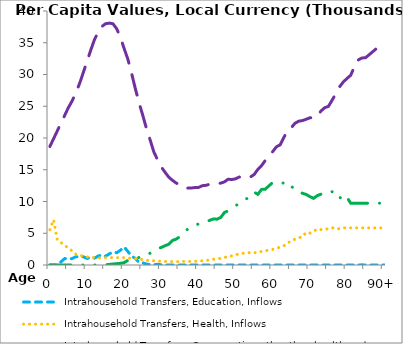
| Category | Intrahousehold Transfers, Education, Inflows | Intrahousehold Transfers, Health, Inflows | Intrahousehold Transfers, Consumption other than health and education, Inflows | Intrahousehold Transfers, Saving, Inflows |
|---|---|---|---|---|
| 0 | 0 | 5561.742 | 18657.643 | 0 |
|  | 0 | 7115.551 | 19886.082 | 0 |
| 2 | 0 | 3966.61 | 21114.521 | 0 |
| 3 | 499.806 | 3531.057 | 22342.96 | 0 |
| 4 | 1022.196 | 3095.505 | 23571.398 | 0 |
| 5 | 933.506 | 2659.953 | 24799.837 | 0 |
| 6 | 1016.164 | 2219.426 | 25843.848 | 0 |
| 7 | 1305.445 | 1701.816 | 27113.855 | 0 |
| 8 | 1271.702 | 1517.784 | 28579.033 | 0 |
| 9 | 1295.995 | 1411.34 | 30305.777 | 0 |
| 10 | 1033.853 | 1269.652 | 32073.857 | 0 |
| 11 | 1191.983 | 1227.058 | 33825.087 | 0 |
| 12 | 1072.887 | 1167.405 | 35482.01 | 0 |
| 13 | 1403.226 | 1120.908 | 36665.673 | 0 |
| 14 | 1610.812 | 1120.605 | 37562.725 | 0 |
| 15 | 1377.068 | 1171.999 | 37996.264 | 25.095 |
| 16 | 1754.147 | 1168.719 | 38094.743 | 92.531 |
| 17 | 2041.123 | 1167.814 | 37984.962 | 159.967 |
| 18 | 1934.246 | 1151.129 | 37194.932 | 210.481 |
| 19 | 2324.245 | 1178.516 | 35855.422 | 269.502 |
| 20 | 2837.624 | 1145.319 | 34091.189 | 361.952 |
| 21 | 2139.803 | 1110.004 | 32410.202 | 732.62 |
| 22 | 1386.523 | 1036.435 | 30202.159 | 815.784 |
| 23 | 1040.392 | 979.979 | 27800.972 | 999.849 |
| 24 | 407.322 | 913.831 | 25562.741 | 1191.646 |
| 25 | 350.988 | 845.684 | 23606.957 | 1515.309 |
| 26 | 147.034 | 732.362 | 21502.001 | 1651.475 |
| 27 | 67.27 | 692.261 | 19691.391 | 1853.696 |
| 28 | 61.057 | 668.262 | 17800.962 | 2062.293 |
| 29 | 109.996 | 630.678 | 16565.641 | 2552.546 |
| 30 | 35.566 | 578.646 | 15436.684 | 2763.899 |
| 31 | 2.471 | 554.282 | 14613.687 | 3034.254 |
| 32 | 4.703 | 533.831 | 13842.622 | 3271.746 |
| 33 | 4.551 | 538.185 | 13340.047 | 3866.808 |
| 34 | 0.351 | 521.507 | 12913.037 | 4072.016 |
| 35 | 0.306 | 542.758 | 12612.917 | 4462.602 |
| 36 | 0.077 | 566.047 | 12255.397 | 5134.983 |
| 37 | 0.948 | 570.137 | 12108.458 | 5595.323 |
| 38 | 4.605 | 562.909 | 12117.203 | 5886.477 |
| 39 | 0 | 577.658 | 12191.717 | 6048.161 |
| 40 | 2.812 | 606.512 | 12200.238 | 6488.857 |
| 41 | 2.52 | 656.458 | 12486.692 | 6762.158 |
| 42 | 0.494 | 720.093 | 12540.72 | 6826.189 |
| 43 | 0.528 | 772.114 | 12715.635 | 7023.58 |
| 44 | 0 | 907.017 | 12710.829 | 7247.739 |
| 45 | 0.433 | 927.184 | 12842.906 | 7215.511 |
| 46 | 0.57 | 1056.817 | 12894.409 | 7489.776 |
| 47 | 2.548 | 1174.301 | 13093.688 | 8270.288 |
| 48 | 0.261 | 1338.636 | 13509.642 | 8522.113 |
| 49 | 0.498 | 1441.872 | 13457.264 | 8928.936 |
| 50 | 14.676 | 1608.367 | 13573.276 | 9389.313 |
| 51 | 0 | 1743.481 | 13858.75 | 9560.545 |
| 52 | 0.305 | 1840.849 | 13748.432 | 9994.869 |
| 53 | 0.015 | 1922.221 | 13948.642 | 10455.114 |
| 54 | 0 | 1947.786 | 13862.771 | 10644.812 |
| 55 | 0 | 1896.218 | 14245.825 | 11479.398 |
| 56 | 0 | 2071.272 | 15054.852 | 11130.662 |
| 57 | 0 | 2112.913 | 15651.633 | 11901.738 |
| 58 | 0.382 | 2251.927 | 16461.854 | 11937.456 |
| 59 | 0 | 2338.85 | 17037.507 | 12479.976 |
| 60 | 0 | 2455.061 | 17859.413 | 12996.995 |
| 61 | 0 | 2643.267 | 18611.772 | 13046.394 |
| 62 | 4.206 | 2818.055 | 18923.778 | 12983.206 |
| 63 | 0 | 3012.518 | 20079.083 | 12882.581 |
| 64 | 0.326 | 3533.178 | 21192.446 | 12190.243 |
| 65 | 0 | 3695.832 | 21629.582 | 12427.966 |
| 66 | 0 | 4091.03 | 22321.331 | 11798.411 |
| 67 | 1.962 | 4296.171 | 22645.732 | 11727.945 |
| 68 | 0 | 4450.445 | 22740.254 | 11287.72 |
| 69 | 0 | 5126.752 | 22949.24 | 11114.164 |
| 70 | 10.364 | 5018.864 | 23185.147 | 10773.639 |
| 71 | 0 | 5322.3 | 23168.083 | 10497.835 |
| 72 | 0 | 5656.749 | 23484.102 | 10917.859 |
| 73 | 0 | 5577.761 | 24255.809 | 11158.004 |
| 74 | 0 | 5629.195 | 24768.366 | 11060.759 |
| 75 | 10.212 | 5702.602 | 24983.022 | 11381.103 |
| 76 | 12.583 | 5882.709 | 25968.056 | 11543.817 |
| 77 | 0 | 5689.228 | 26985.357 | 11438.611 |
| 78 | 0 | 5710.073 | 28065.267 | 10476.315 |
| 79 | 0 | 5849.925 | 28821.216 | 11132.155 |
| 80 | 0 | 5849.925 | 29375.254 | 10641.288 |
| 81 | 0 | 5849.925 | 29882.868 | 9732.67 |
| 82 | 0 | 5849.925 | 31245.208 | 9732.67 |
| 83 | 0 | 5849.925 | 32283.171 | 9732.67 |
| 84 | 25.523 | 5849.925 | 32604.364 | 9732.67 |
| 85 | 0 | 5849.925 | 32641.594 | 9732.67 |
| 86 | 0 | 5849.925 | 33133.413 | 9732.67 |
| 87 | 0 | 5849.925 | 33625.232 | 9732.67 |
| 88 | 0 | 5849.925 | 34117.051 | 9732.67 |
| 89 | 0 | 5849.925 | 34608.87 | 9732.67 |
| 90+ | 0.964 | 5849.925 | 35100.689 | 9732.67 |